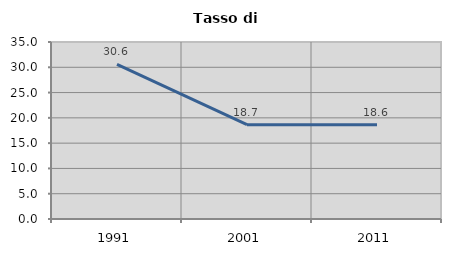
| Category | Tasso di disoccupazione   |
|---|---|
| 1991.0 | 30.564 |
| 2001.0 | 18.652 |
| 2011.0 | 18.618 |